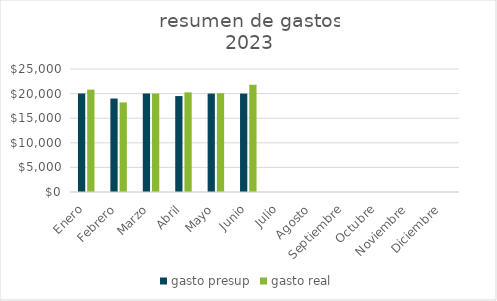
| Category | gasto presup | gasto real |
|---|---|---|
| Enero | 20000 | 20800 |
| Febrero | 19000 | 18200 |
| Marzo | 20000 | 20000 |
| Abril | 19500 | 20250 |
| Mayo | 20000 | 20050 |
| Junio | 20000 | 21800 |
| Julio | 0 | 0 |
| Agosto | 0 | 0 |
| Septiembre | 0 | 0 |
| Octubre | 0 | 0 |
| Noviembre | 0 | 0 |
| Diciembre | 0 | 0 |